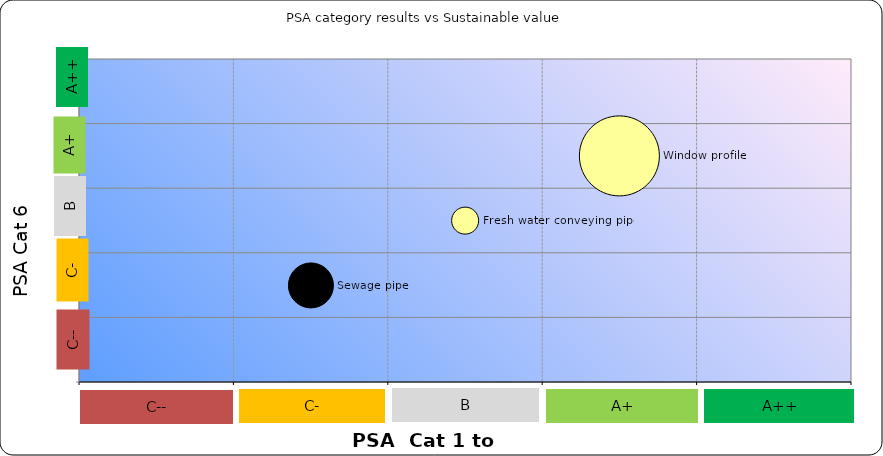
| Category | PSA category results vs Sustainable value |
|---|---|
| 16.0 | 2 |
| 0.0 | 0 |
| -16.0 | -2 |
| 0.0 | 0 |
| 0.0 | 0 |
| 0.0 | 0 |
| 0.0 | 0 |
| 0.0 | 0 |
| 0.0 | 0 |
| 0.0 | 0 |